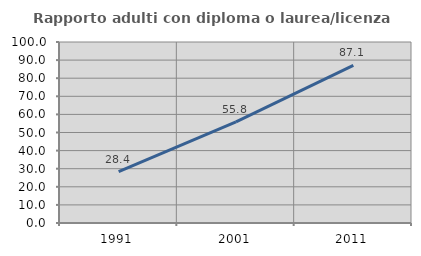
| Category | Rapporto adulti con diploma o laurea/licenza media  |
|---|---|
| 1991.0 | 28.438 |
| 2001.0 | 55.848 |
| 2011.0 | 87.065 |